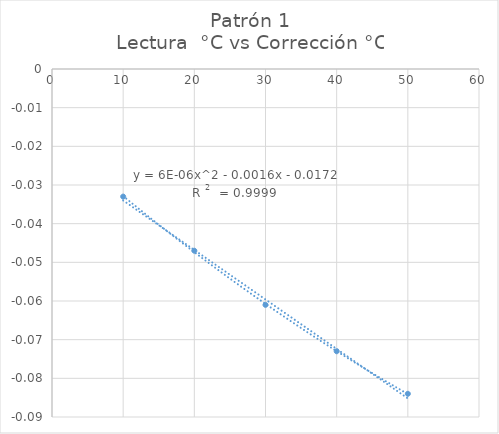
| Category | Corrección °C |
|---|---|
| 10.0 | -0.033 |
| 20.003 | -0.047 |
| 29.997 | -0.061 |
| 40.002 | -0.073 |
| 50.002 | -0.084 |